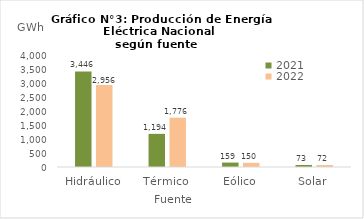
| Category | 2021 | 2022 |
|---|---|---|
| Hidráulico | 3445.547 | 2956.383 |
| Térmico | 1194.284 | 1776.106 |
| Eólico | 159.173 | 150.477 |
| Solar | 72.948 | 71.794 |